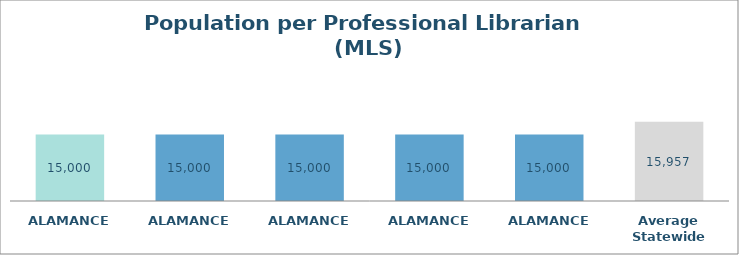
| Category | Series 0 |
|---|---|
| ALAMANCE  | 14999.727 |
| ALAMANCE  | 14999.727 |
| ALAMANCE  | 14999.727 |
| ALAMANCE  | 14999.727 |
| ALAMANCE  | 14999.727 |
| Average Statewide | 15957.084 |